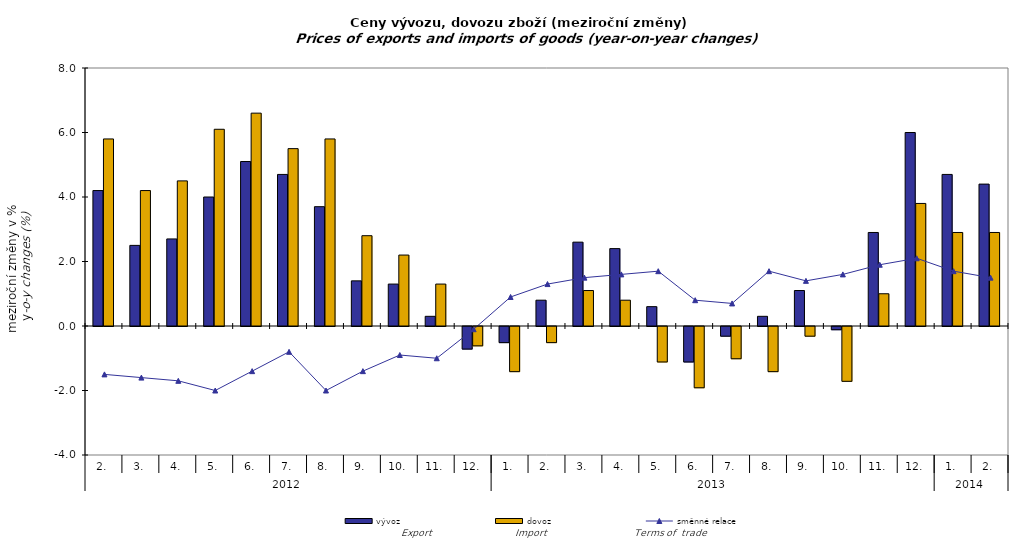
| Category | vývoz | dovoz |
|---|---|---|
| 0 | 4.2 | 5.8 |
| 1 | 2.5 | 4.2 |
| 2 | 2.7 | 4.5 |
| 3 | 4 | 6.1 |
| 4 | 5.1 | 6.6 |
| 5 | 4.7 | 5.5 |
| 6 | 3.7 | 5.8 |
| 7 | 1.4 | 2.8 |
| 8 | 1.3 | 2.2 |
| 9 | 0.3 | 1.3 |
| 10 | -0.7 | -0.6 |
| 11 | -0.5 | -1.4 |
| 12 | 0.8 | -0.5 |
| 13 | 2.6 | 1.1 |
| 14 | 2.4 | 0.8 |
| 15 | 0.6 | -1.1 |
| 16 | -1.1 | -1.9 |
| 17 | -0.3 | -1 |
| 18 | 0.3 | -1.4 |
| 19 | 1.1 | -0.3 |
| 20 | -0.1 | -1.7 |
| 21 | 2.9 | 1 |
| 22 | 6 | 3.8 |
| 23 | 4.7 | 2.9 |
| 24 | 4.4 | 2.9 |